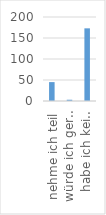
| Category | Series 0 |
|---|---|
| nehme ich teil | 45 |
| würde ich gern teilnehmen | 3 |
| habe ich kein Interesse. | 173 |